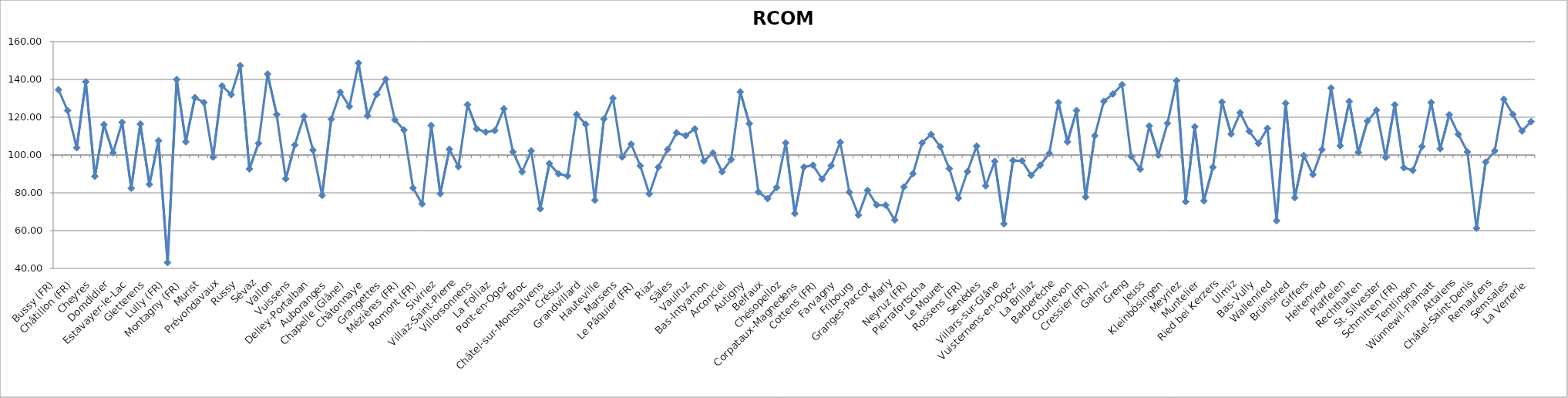
| Category | RCOM indices |
|---|---|
| Bussy (FR) | 134.585 |
| Châbles | 123.511 |
| Châtillon (FR) | 103.862 |
| Cheiry | 138.762 |
| Cheyres | 88.711 |
| Cugy (FR) | 116.084 |
| Domdidier | 101.144 |
| Dompierre (FR) | 117.33 |
| Estavayer-le-Lac | 82.399 |
| Fétigny | 116.402 |
| Gletterens | 84.476 |
| Léchelles | 107.556 |
| Lully (FR) | 43.065 |
| Ménières | 139.955 |
| Montagny (FR) | 106.992 |
| Morens (FR) | 130.411 |
| Murist | 127.842 |
| Nuvilly | 98.911 |
| Prévondavaux | 136.575 |
| Rueyres-les-Prés | 131.93 |
| Russy | 147.336 |
| Saint-Aubin (FR) | 92.626 |
| Sévaz | 106.186 |
| Surpierre | 142.853 |
| Vallon | 121.44 |
| Villeneuve (FR) | 87.432 |
| Vuissens | 105.359 |
| Les Montets | 120.454 |
| Delley-Portalban | 102.598 |
| Vernay | 78.673 |
| Auboranges | 118.982 |
| Billens-Hennens | 133.267 |
| Chapelle (Glâne) | 125.712 |
| Le Châtelard | 148.62 |
| Châtonnaye | 120.794 |
| Ecublens (FR) | 132.049 |
| Grangettes | 140.15 |
| Massonnens | 118.655 |
| Mézières (FR) | 113.267 |
| Montet (Glâne) | 82.547 |
| Romont (FR) | 74.107 |
| Rue | 115.667 |
| Siviriez | 79.585 |
| Ursy | 103.03 |
| Villaz-Saint-Pierre | 93.884 |
| Vuisternens-devant-Romont | 126.671 |
| Villorsonnens | 113.893 |
| Torny | 112.168 |
| La Folliaz | 112.947 |
| Haut-Intyamon | 124.467 |
| Pont-en-Ogoz | 101.661 |
| Botterens | 91.091 |
| Broc | 102.144 |
| Bulle | 71.544 |
| Châtel-sur-Montsalvens | 95.442 |
| Corbières | 90.068 |
| Crésuz | 88.948 |
| Echarlens | 121.487 |
| Grandvillard | 116.266 |
| Gruyères | 76.096 |
| Hauteville | 119.064 |
| Jaun | 130.044 |
| Marsens | 98.969 |
| Morlon | 105.798 |
| Le Pâquier (FR) | 94.315 |
| Pont-la-Ville | 79.434 |
| Riaz | 93.61 |
| La Roche | 102.903 |
| Sâles | 111.745 |
| Sorens | 110.291 |
| Vaulruz | 113.833 |
| Vuadens | 96.79 |
| Bas-Intyamon | 101.106 |
| Val-de-Charmey | 91.122 |
| Arconciel | 97.612 |
| Autafond | 133.376 |
| Autigny | 116.624 |
| Avry | 80.42 |
| Belfaux | 76.9 |
| Chénens | 82.821 |
| Chésopelloz | 106.418 |
| Corminboeuf | 69.066 |
| Corpataux-Magnedens | 93.646 |
| Corserey | 94.622 |
| Cottens (FR) | 87.257 |
| Ependes (FR) | 94.364 |
| Farvagny | 106.724 |
| Ferpicloz | 80.382 |
| Fribourg | 68.243 |
| Givisiez | 81.272 |
| Granges-Paccot | 73.564 |
| Grolley | 73.478 |
| Marly | 65.6 |
| Matran | 83.074 |
| Neyruz (FR) | 90.09 |
| Noréaz | 106.421 |
| Pierrafortscha | 110.919 |
| Ponthaux | 104.43 |
| Le Mouret | 92.81 |
| Prez-vers-Noréaz | 77.195 |
| Rossens (FR) | 91.275 |
| Le Glèbe | 104.723 |
| Senèdes | 83.713 |
| Treyvaux | 96.647 |
| Villars-sur-Glâne | 63.602 |
| Villarsel-sur-Marly | 97.106 |
| Vuisternens-en-Ogoz | 96.932 |
| Hauterive (FR) | 89.226 |
| La Brillaz | 94.593 |
| La Sonnaz | 100.877 |
| Barberêche | 127.776 |
| Courgevaux | 107 |
| Courlevon | 123.55 |
| Courtepin | 77.746 |
| Cressier (FR) | 110.201 |
| Fräschels | 128.433 |
| Galmiz | 132.281 |
| Gempenach | 137.253 |
| Greng | 99.378 |
| Gurmels | 92.57 |
| Jeuss | 115.414 |
| Kerzers | 99.955 |
| Kleinbösingen | 116.823 |
| Lurtigen | 139.312 |
| Meyriez | 75.36 |
| Misery-Courtion | 114.956 |
| Muntelier | 75.746 |
| Murten | 93.588 |
| Ried bei Kerzers | 128.029 |
| Salvenach | 111.097 |
| Ulmiz | 122.412 |
| Villarepos | 112.535 |
| Bas-Vully | 106.161 |
| Haut-Vully | 114.108 |
| Wallenried | 65.244 |
| Alterswil | 127.378 |
| Brünisried | 77.385 |
| Düdingen | 99.728 |
| Giffers | 89.675 |
| Bösingen | 102.854 |
| Heitenried | 135.455 |
| Oberschrot | 104.896 |
| Plaffeien | 128.376 |
| Plasselb | 101.418 |
| Rechthalten | 117.996 |
| St. Antoni | 123.682 |
| St. Silvester | 98.782 |
| St. Ursen | 126.603 |
| Schmitten (FR) | 93.297 |
| Tafers | 91.886 |
| Tentlingen | 104.499 |
| Ueberstorf | 127.81 |
| Wünnewil-Flamatt | 103.318 |
| Zumholz | 121.305 |
| Attalens | 110.964 |
| Bossonnens | 101.63 |
| Châtel-Saint-Denis | 61.28 |
| Granges (Veveyse) | 96.272 |
| Remaufens | 102.201 |
| Saint-Martin (FR) | 129.518 |
| Semsales | 121.512 |
| Le Flon | 112.697 |
| La Verrerie | 117.68 |